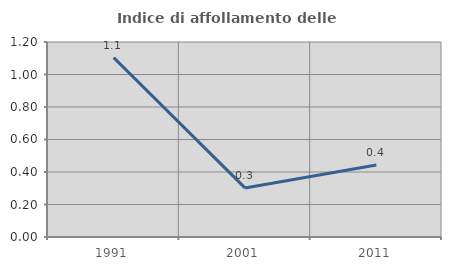
| Category | Indice di affollamento delle abitazioni  |
|---|---|
| 1991.0 | 1.104 |
| 2001.0 | 0.302 |
| 2011.0 | 0.443 |